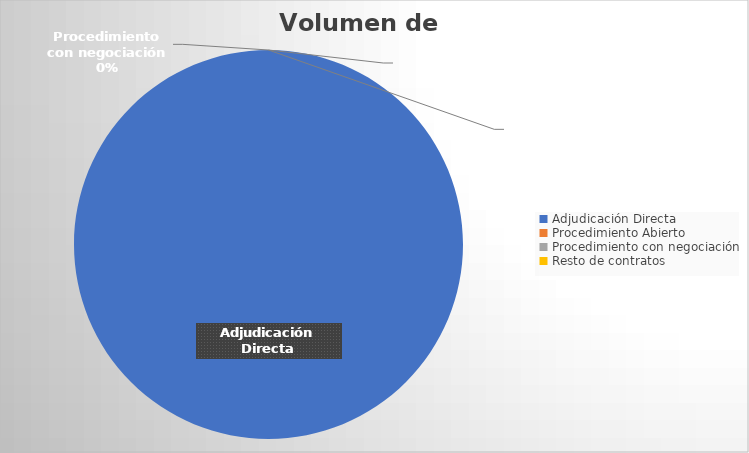
| Category | Series 0 |
|---|---|
| Adjudicación Directa | 1 |
| Procedimiento Abierto | 0 |
| Procedimiento con negociación | 0 |
| Resto de contratos | 0 |